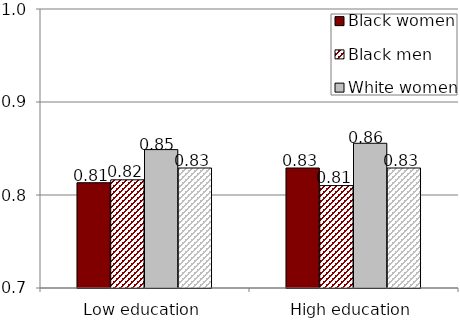
| Category | Black women | Black men | White women | White men |
|---|---|---|---|---|
| Low education | 0.813 | 0.816 | 0.849 | 0.829 |
| High education | 0.829 | 0.81 | 0.856 | 0.829 |